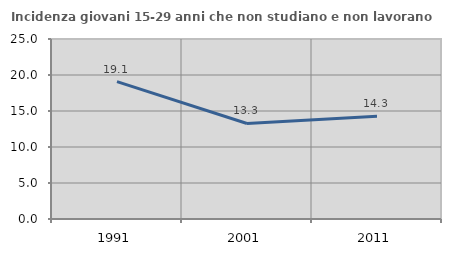
| Category | Incidenza giovani 15-29 anni che non studiano e non lavorano  |
|---|---|
| 1991.0 | 19.081 |
| 2001.0 | 13.265 |
| 2011.0 | 14.286 |